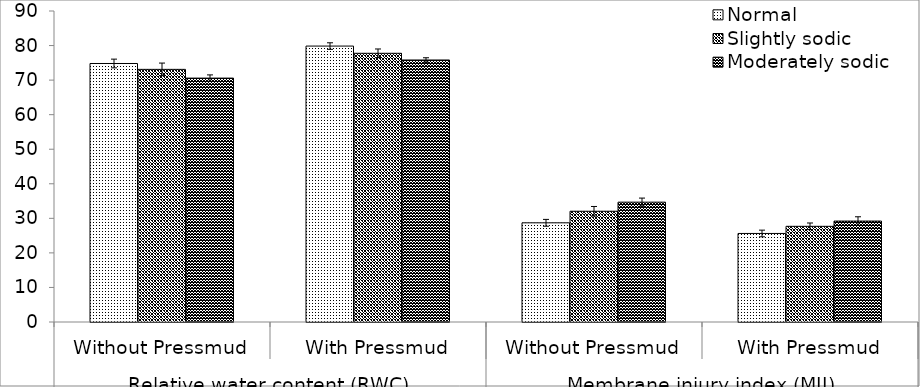
| Category | Normal | Slightly sodic | Moderately sodic |
|---|---|---|---|
| 0 | 74.81 | 73.11 | 70.58 |
| 1 | 79.85 | 77.76 | 75.82 |
| 2 | 28.7 | 32.05 | 34.68 |
| 3 | 25.62 | 27.69 | 29.21 |